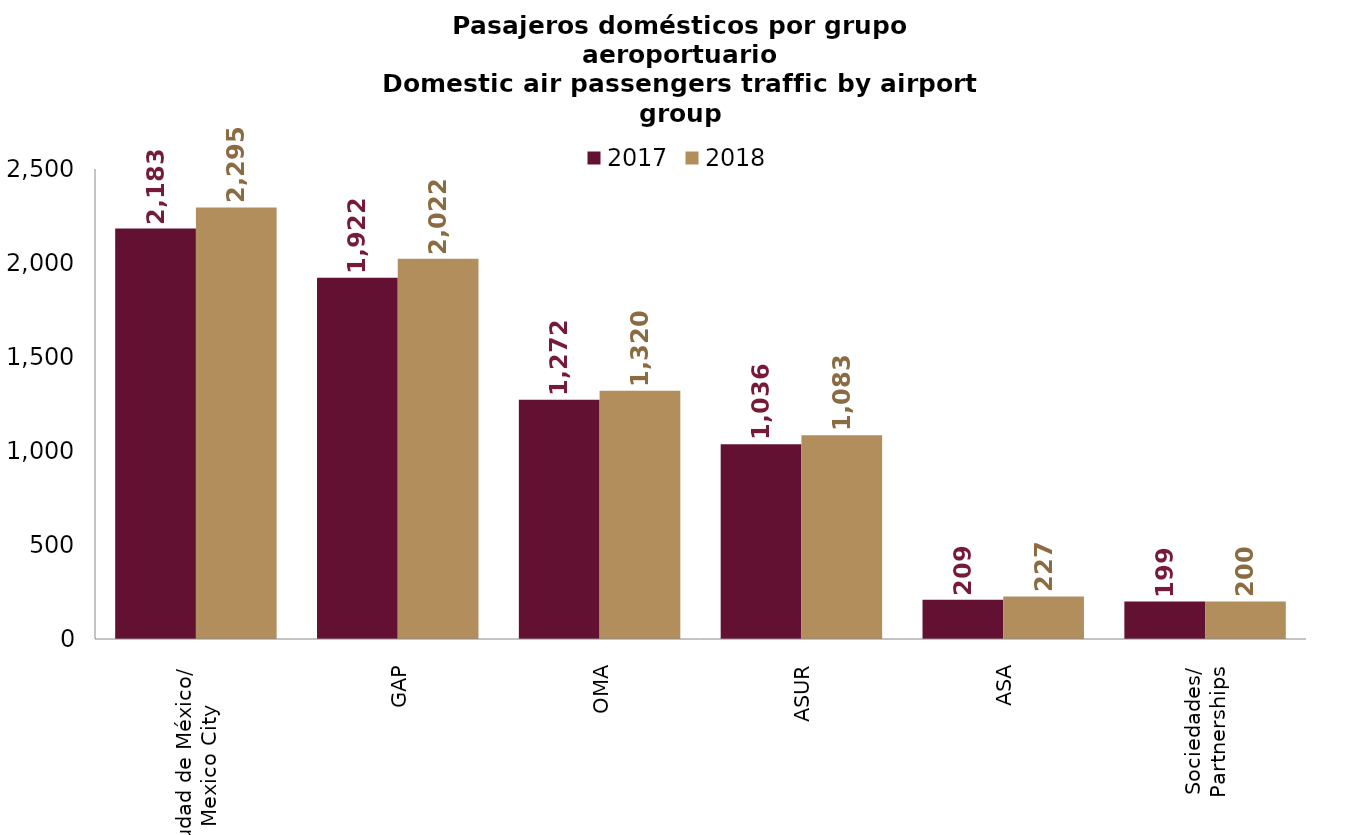
| Category | 2017 | 2018 |
|---|---|---|
| Ciudad de México/
Mexico City | 2182.951 | 2295.334 |
| GAP | 1921.77 | 2022.105 |
| OMA | 1272.319 | 1320.303 |
| ASUR | 1035.507 | 1083.453 |
| ASA | 208.956 | 226.52 |
| Sociedades/
Partnerships | 198.865 | 199.94 |